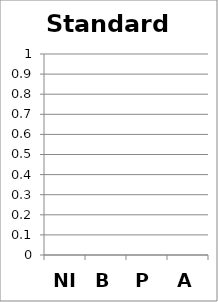
| Category | Standard 8 |
|---|---|
| NI | 0 |
| B | 0 |
| P | 0 |
| A | 0 |